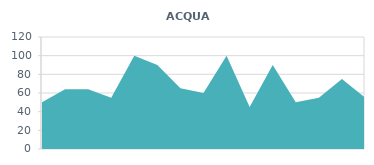
| Category | ACQUA (L) |
|---|---|
| 0 | 50 |
| 1 | 64 |
| 2 | 64 |
| 3 | 55 |
| 4 | 100 |
| 5 | 90 |
| 6 | 65 |
| 7 | 60 |
| 8 | 100 |
| 9 | 45 |
| 10 | 90 |
| 11 | 50 |
| 12 | 55 |
| 13 | 75 |
| 14 | 55 |